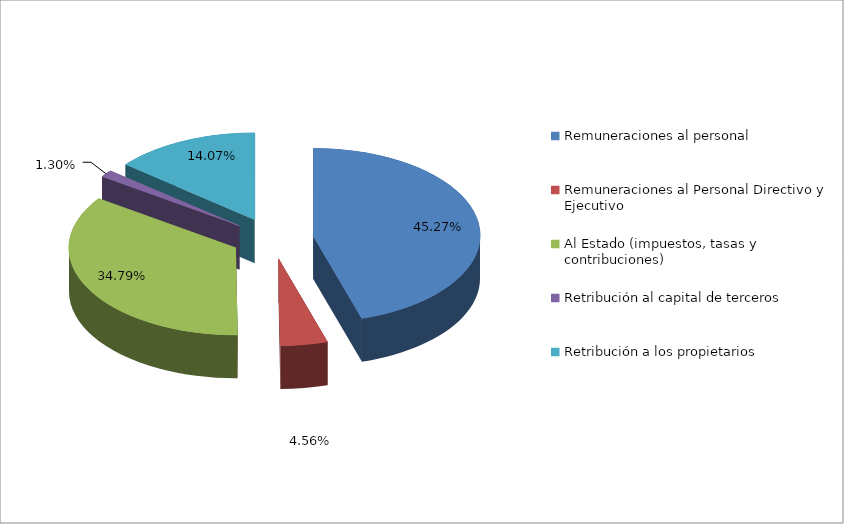
| Category | Series 0 |
|---|---|
| Remuneraciones al personal | 0.453 |
| Remuneraciones al Personal Directivo y Ejecutivo | 0.046 |
| Al Estado (impuestos, tasas y contribuciones) | 0.348 |
| Retribución al capital de terceros | 0.013 |
| Retribución a los propietarios | 0.141 |